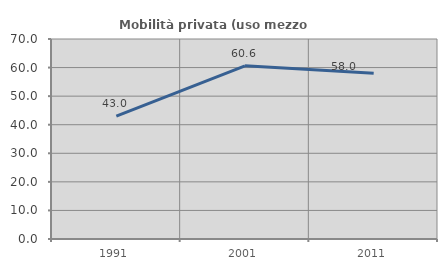
| Category | Mobilità privata (uso mezzo privato) |
|---|---|
| 1991.0 | 43.036 |
| 2001.0 | 60.611 |
| 2011.0 | 57.986 |